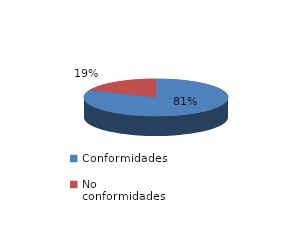
| Category | Series 0 |
|---|---|
| Conformidades | 360 |
| No conformidades | 83 |